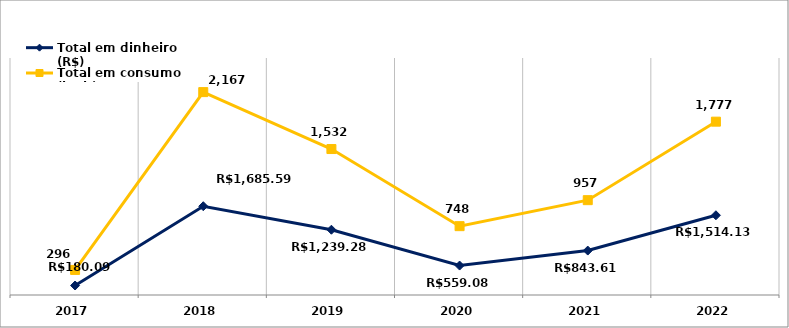
| Category | Total em dinheiro (R$) | Total em consumo (kWh) |
|---|---|---|
| 2017.0 | 180.09 | 296 |
| 2018.0 | 1685.59 | 2167 |
| 2019.0 | 1239.28 | 1532 |
| 2020.0 | 559.08 | 748 |
| 2021.0 | 843.61 | 957 |
| 2022.0 | 1514.13 | 1777 |